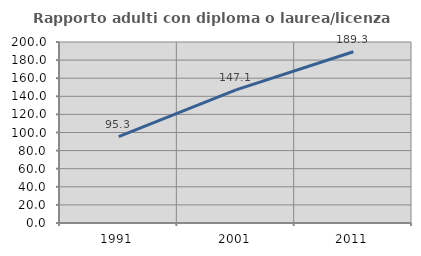
| Category | Rapporto adulti con diploma o laurea/licenza media  |
|---|---|
| 1991.0 | 95.349 |
| 2001.0 | 147.054 |
| 2011.0 | 189.28 |